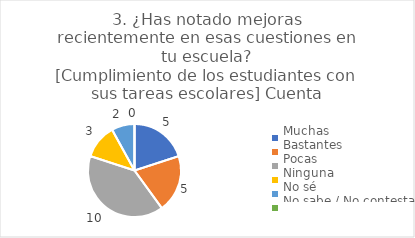
| Category | 3. ¿Has notado mejoras recientemente en esas cuestiones en tu escuela?
[Cumplimiento de los estudiantes con sus tareas escolares] |
|---|---|
| Muchas  | 0.2 |
| Bastantes  | 0.2 |
| Pocas  | 0.4 |
| Ninguna  | 0.12 |
| No sé  | 0.08 |
| No sabe / No contesta | 0 |